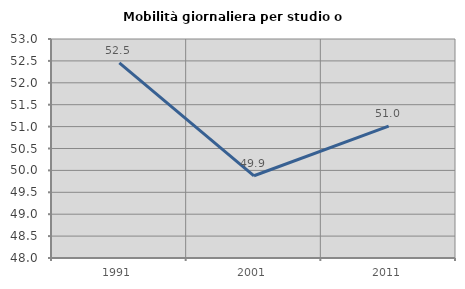
| Category | Mobilità giornaliera per studio o lavoro |
|---|---|
| 1991.0 | 52.455 |
| 2001.0 | 49.877 |
| 2011.0 | 51.012 |